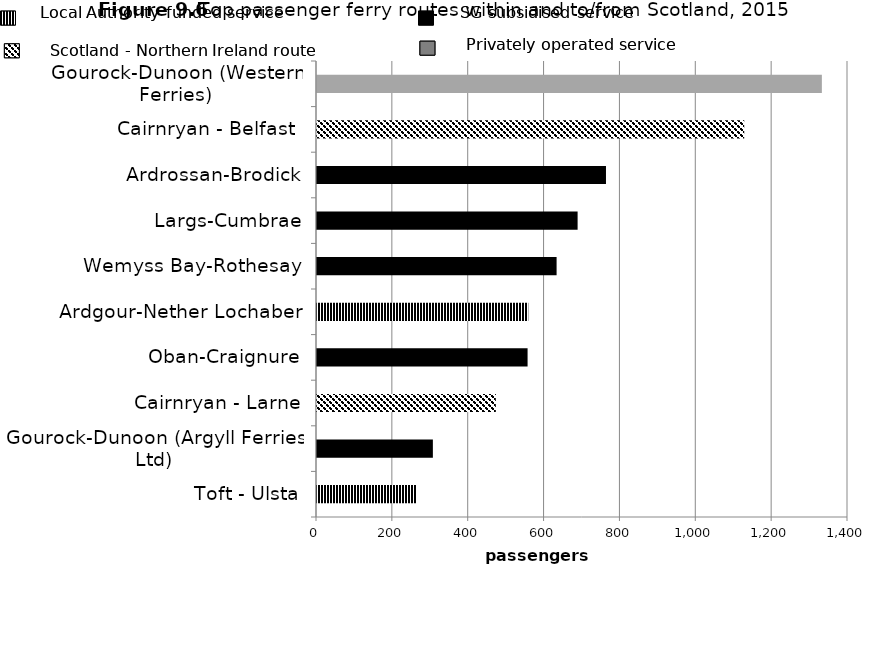
| Category | Series 0 |
|---|---|
| Toft - Ulsta | 261.07 |
| Gourock-Dunoon (Argyll Ferries Ltd) | 305.5 |
| Cairnryan - Larne | 471.51 |
| Oban-Craignure | 555.2 |
| Ardgour-Nether Lochaber | 557 |
| Wemyss Bay-Rothesay | 631.7 |
| Largs-Cumbrae | 687.1 |
| Ardrossan-Brodick | 761.9 |
| Cairnryan - Belfast  | 1126.373 |
| Gourock-Dunoon (Western Ferries) | 1331.1 |